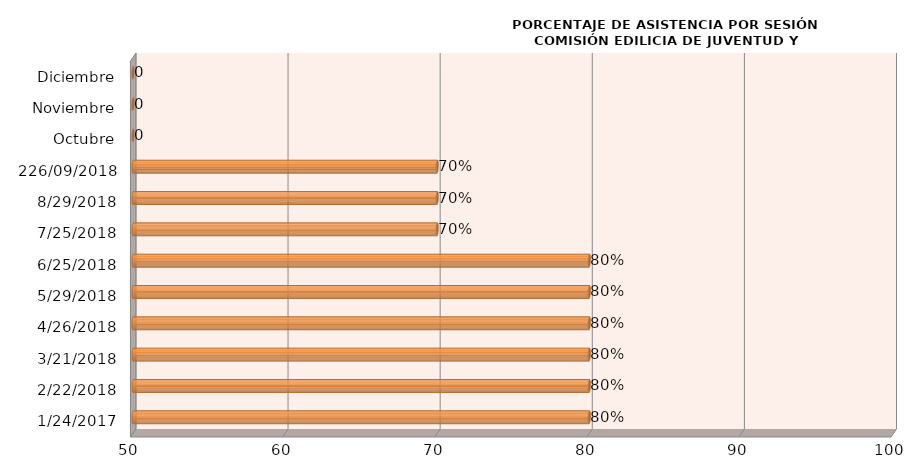
| Category | Series 0 |
|---|---|
| 24/01/2017 | 80 |
| 22/02/2018 | 80 |
| 21/03/2018 | 80 |
| 26/04/2018 | 80 |
| 29/05/2018 | 80 |
| 25/06/2018 | 80 |
| 25/07/2018 | 70 |
| 29/08/2018 | 70 |
| 226/09/2018 | 70 |
| Octubre | 0 |
| Noviembre | 0 |
| Diciembre | 0 |